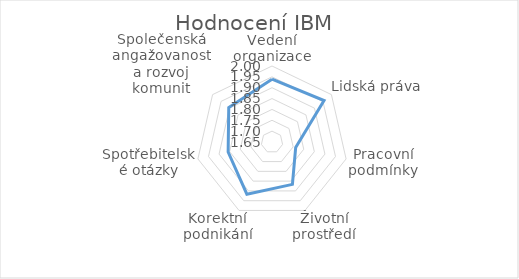
| Category | Series 0 |
|---|---|
| Vedení organizace | 1.939 |
| Lidská práva | 1.957 |
| Pracovní podmínky | 1.762 |
| Životní prostředí | 1.867 |
| Korektní podnikání | 1.917 |
| Spotřebitelské otázky | 1.857 |
| Společenská angažovanost a rozvoj komunit | 1.905 |